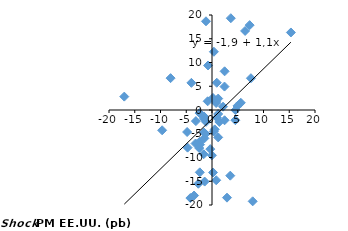
| Category | Mexico |
|---|---|
| 0.660000000000005 | -42.877 |
| 15.32 | 16.321 |
| -17.02999999999999 | 2.818 |
| -4.74 | -7.924 |
| 2.9099999999999904 | -18.453 |
| -8.040000000000003 | 6.706 |
| -1.419999999999999 | -15.066 |
| -3.9999999999999925 | 5.717 |
| -9.68 | -4.271 |
| 5.5899999999999945 | 1.519 |
| -2.42 | -0.648 |
| 4.9399999999999995 | 0.856 |
| 0.34000000000000696 | -4.526 |
| -1.6199999999999992 | -9.312 |
| -2.410000000000001 | -6.687 |
| -1.5900000000000025 | -4.73 |
| 8.889999999999997 | 22.794 |
| 0.18000000000000238 | 2.542 |
| -4.830000000000001 | -4.632 |
| 1.419999999999999 | -2.519 |
| -2.4699999999999998 | -8.011 |
| -7.9600000000000035 | -20.559 |
| 3.6500000000000004 | 19.323 |
| 0.20000000000000018 | -13.155 |
| 1.5899999999999999 | 22.586 |
| -2.37 | -13.122 |
| 6.429999999999997 | 16.646 |
| -0.8400000000000019 | 1.833 |
| 0.8199999999999985 | -14.789 |
| 1.200000000000001 | -5.767 |
| 0.8000000000000007 | 1.788 |
| 2.430000000000004 | 4.931 |
| 1.200000000000001 | -0.838 |
| -1.5600000000000003 | -1.344 |
| 0.8099999999999996 | 1.471 |
| -1.16 | -2.492 |
| 6.459999999999999 | 51.054 |
| 1.200000000000001 | 2.405 |
| -3.63 | -28.617 |
| -0.7699999999999985 | 9.373 |
| 4.539999999999999 | -2.146 |
| 0.37000000000000366 | 12.262 |
| 7.31 | 17.867 |
| -3.1300000000000052 | -2.34 |
| -3.200000000000003 | -7.056 |
| -1.1700000000000044 | 18.677 |
| 2.4399999999999977 | -2.163 |
| 7.5600000000000005 | 6.694 |
| 7.899999999999996 | -19.226 |
| 0.5300000000000082 | -4.079 |
| -2.650000000000008 | -15.521 |
| 0.9250000000000091 | 5.739 |
| -2.3249999999999993 | -7.297 |
| 0.9399999999999964 | -1.593 |
| -4.200000000000004 | -18.533 |
| 2.4499999999999966 | 8.143 |
| 3.5500000000000087 | -13.826 |
| -0.01500000000000945 | -9.54 |
| -3.4800000000000164 | -18.005 |
| -1.2599999999999945 | -5.029 |
| -1.475000000000004 | -5.968 |
| 2.1399999999999864 | 0.697 |
| -0.33400000000001207 | -8.234 |
| -1.556000000000024 | -1.849 |
| 4.5560000000000045 | -0.028 |